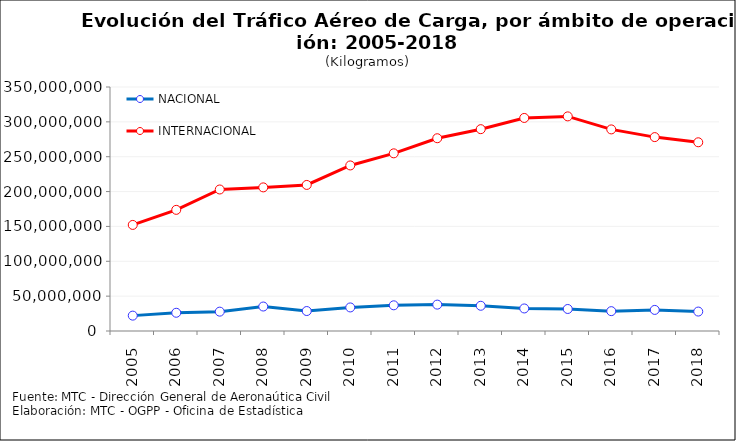
| Category | NACIONAL | INTERNACIONAL |
|---|---|---|
| 2005.0 | 22053913 | 152162482 |
| 2006.0 | 26150832 | 173777364 |
| 2007.0 | 27764312 | 202991789 |
| 2008.0 | 35110589 | 206007436 |
| 2009.0 | 28642423 | 209528755 |
| 2010.0 | 33791163 | 237475797 |
| 2011.0 | 36851471 | 254848250 |
| 2012.0 | 37841993 | 276504750 |
| 2013.0 | 36190473 | 289509854 |
| 2014.0 | 32336512.62 | 305620560 |
| 2015.0 | 31573152.053 | 307842353 |
| 2016.0 | 28477225.46 | 289166930 |
| 2017.0 | 30255976.8 | 278123530 |
| 2018.0 | 27885491.99 | 270708757 |